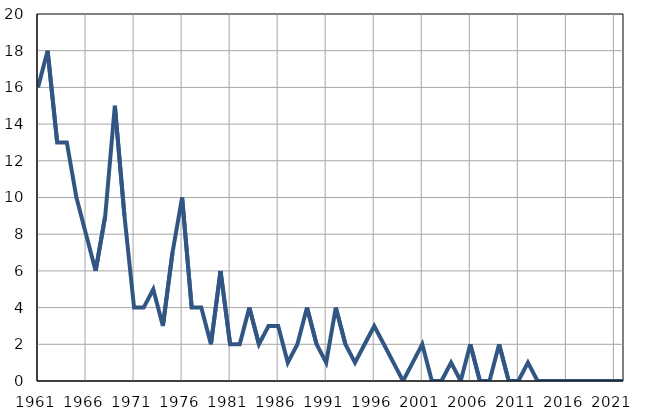
| Category | Infants
deaths |
|---|---|
| 1961.0 | 16 |
| 1962.0 | 18 |
| 1963.0 | 13 |
| 1964.0 | 13 |
| 1965.0 | 10 |
| 1966.0 | 8 |
| 1967.0 | 6 |
| 1968.0 | 9 |
| 1969.0 | 15 |
| 1970.0 | 9 |
| 1971.0 | 4 |
| 1972.0 | 4 |
| 1973.0 | 5 |
| 1974.0 | 3 |
| 1975.0 | 7 |
| 1976.0 | 10 |
| 1977.0 | 4 |
| 1978.0 | 4 |
| 1979.0 | 2 |
| 1980.0 | 6 |
| 1981.0 | 2 |
| 1982.0 | 2 |
| 1983.0 | 4 |
| 1984.0 | 2 |
| 1985.0 | 3 |
| 1986.0 | 3 |
| 1987.0 | 1 |
| 1988.0 | 2 |
| 1989.0 | 4 |
| 1990.0 | 2 |
| 1991.0 | 1 |
| 1992.0 | 4 |
| 1993.0 | 2 |
| 1994.0 | 1 |
| 1995.0 | 2 |
| 1996.0 | 3 |
| 1997.0 | 2 |
| 1998.0 | 1 |
| 1999.0 | 0 |
| 2000.0 | 1 |
| 2001.0 | 2 |
| 2002.0 | 0 |
| 2003.0 | 0 |
| 2004.0 | 1 |
| 2005.0 | 0 |
| 2006.0 | 2 |
| 2007.0 | 0 |
| 2008.0 | 0 |
| 2009.0 | 2 |
| 2010.0 | 0 |
| 2011.0 | 0 |
| 2012.0 | 1 |
| 2013.0 | 0 |
| 2014.0 | 0 |
| 2015.0 | 0 |
| 2016.0 | 0 |
| 2017.0 | 0 |
| 2018.0 | 0 |
| 2019.0 | 0 |
| 2020.0 | 0 |
| 2021.0 | 0 |
| 2022.0 | 0 |